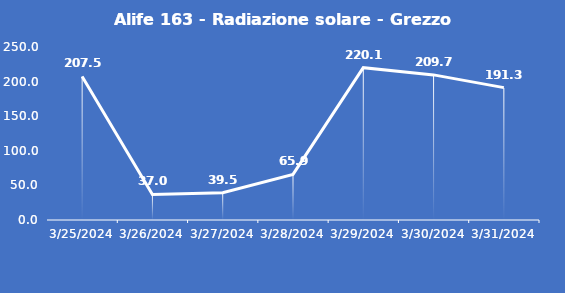
| Category | Alife 163 - Radiazione solare - Grezzo (W/m2) |
|---|---|
| 3/25/24 | 207.5 |
| 3/26/24 | 37 |
| 3/27/24 | 39.5 |
| 3/28/24 | 65.9 |
| 3/29/24 | 220.1 |
| 3/30/24 | 209.7 |
| 3/31/24 | 191.3 |